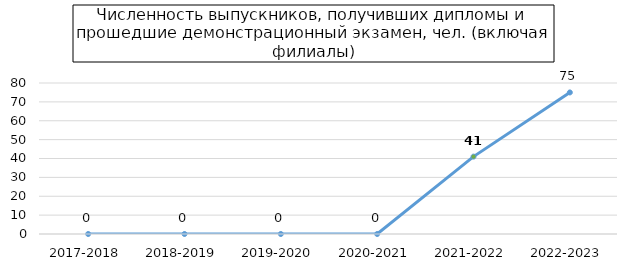
| Category | Series 0 |
|---|---|
| 2017-2018 | 0 |
| 2018-2019 | 0 |
| 2019-2020 | 0 |
| 2020-2021 | 0 |
| 2021-2022 | 41 |
| 2022-2023 | 75 |